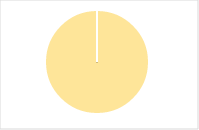
| Category | Total |
|---|---|
| Y | 0 |
| R | 0 |
| T | 0 |
| M | 0 |
| F | 0 |
| N | 26 |